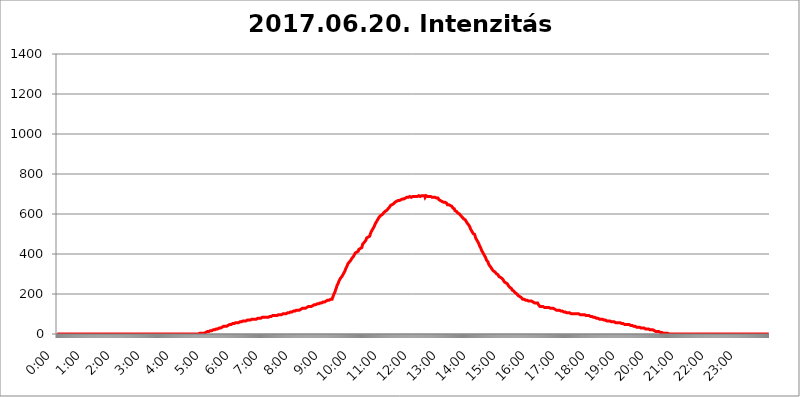
| Category | 2017.06.20. Intenzitás [W/m^2] |
|---|---|
| 0.0 | 0 |
| 0.0006944444444444445 | 0 |
| 0.001388888888888889 | 0 |
| 0.0020833333333333333 | 0 |
| 0.002777777777777778 | 0 |
| 0.003472222222222222 | 0 |
| 0.004166666666666667 | 0 |
| 0.004861111111111111 | 0 |
| 0.005555555555555556 | 0 |
| 0.0062499999999999995 | 0 |
| 0.006944444444444444 | 0 |
| 0.007638888888888889 | 0 |
| 0.008333333333333333 | 0 |
| 0.009027777777777779 | 0 |
| 0.009722222222222222 | 0 |
| 0.010416666666666666 | 0 |
| 0.011111111111111112 | 0 |
| 0.011805555555555555 | 0 |
| 0.012499999999999999 | 0 |
| 0.013194444444444444 | 0 |
| 0.013888888888888888 | 0 |
| 0.014583333333333332 | 0 |
| 0.015277777777777777 | 0 |
| 0.015972222222222224 | 0 |
| 0.016666666666666666 | 0 |
| 0.017361111111111112 | 0 |
| 0.018055555555555557 | 0 |
| 0.01875 | 0 |
| 0.019444444444444445 | 0 |
| 0.02013888888888889 | 0 |
| 0.020833333333333332 | 0 |
| 0.02152777777777778 | 0 |
| 0.022222222222222223 | 0 |
| 0.02291666666666667 | 0 |
| 0.02361111111111111 | 0 |
| 0.024305555555555556 | 0 |
| 0.024999999999999998 | 0 |
| 0.025694444444444447 | 0 |
| 0.02638888888888889 | 0 |
| 0.027083333333333334 | 0 |
| 0.027777777777777776 | 0 |
| 0.02847222222222222 | 0 |
| 0.029166666666666664 | 0 |
| 0.029861111111111113 | 0 |
| 0.030555555555555555 | 0 |
| 0.03125 | 0 |
| 0.03194444444444445 | 0 |
| 0.03263888888888889 | 0 |
| 0.03333333333333333 | 0 |
| 0.034027777777777775 | 0 |
| 0.034722222222222224 | 0 |
| 0.035416666666666666 | 0 |
| 0.036111111111111115 | 0 |
| 0.03680555555555556 | 0 |
| 0.0375 | 0 |
| 0.03819444444444444 | 0 |
| 0.03888888888888889 | 0 |
| 0.03958333333333333 | 0 |
| 0.04027777777777778 | 0 |
| 0.04097222222222222 | 0 |
| 0.041666666666666664 | 0 |
| 0.042361111111111106 | 0 |
| 0.04305555555555556 | 0 |
| 0.043750000000000004 | 0 |
| 0.044444444444444446 | 0 |
| 0.04513888888888889 | 0 |
| 0.04583333333333334 | 0 |
| 0.04652777777777778 | 0 |
| 0.04722222222222222 | 0 |
| 0.04791666666666666 | 0 |
| 0.04861111111111111 | 0 |
| 0.049305555555555554 | 0 |
| 0.049999999999999996 | 0 |
| 0.05069444444444445 | 0 |
| 0.051388888888888894 | 0 |
| 0.052083333333333336 | 0 |
| 0.05277777777777778 | 0 |
| 0.05347222222222222 | 0 |
| 0.05416666666666667 | 0 |
| 0.05486111111111111 | 0 |
| 0.05555555555555555 | 0 |
| 0.05625 | 0 |
| 0.05694444444444444 | 0 |
| 0.057638888888888885 | 0 |
| 0.05833333333333333 | 0 |
| 0.05902777777777778 | 0 |
| 0.059722222222222225 | 0 |
| 0.06041666666666667 | 0 |
| 0.061111111111111116 | 0 |
| 0.06180555555555556 | 0 |
| 0.0625 | 0 |
| 0.06319444444444444 | 0 |
| 0.06388888888888888 | 0 |
| 0.06458333333333334 | 0 |
| 0.06527777777777778 | 0 |
| 0.06597222222222222 | 0 |
| 0.06666666666666667 | 0 |
| 0.06736111111111111 | 0 |
| 0.06805555555555555 | 0 |
| 0.06874999999999999 | 0 |
| 0.06944444444444443 | 0 |
| 0.07013888888888889 | 0 |
| 0.07083333333333333 | 0 |
| 0.07152777777777779 | 0 |
| 0.07222222222222223 | 0 |
| 0.07291666666666667 | 0 |
| 0.07361111111111111 | 0 |
| 0.07430555555555556 | 0 |
| 0.075 | 0 |
| 0.07569444444444444 | 0 |
| 0.0763888888888889 | 0 |
| 0.07708333333333334 | 0 |
| 0.07777777777777778 | 0 |
| 0.07847222222222222 | 0 |
| 0.07916666666666666 | 0 |
| 0.0798611111111111 | 0 |
| 0.08055555555555556 | 0 |
| 0.08125 | 0 |
| 0.08194444444444444 | 0 |
| 0.08263888888888889 | 0 |
| 0.08333333333333333 | 0 |
| 0.08402777777777777 | 0 |
| 0.08472222222222221 | 0 |
| 0.08541666666666665 | 0 |
| 0.08611111111111112 | 0 |
| 0.08680555555555557 | 0 |
| 0.08750000000000001 | 0 |
| 0.08819444444444445 | 0 |
| 0.08888888888888889 | 0 |
| 0.08958333333333333 | 0 |
| 0.09027777777777778 | 0 |
| 0.09097222222222222 | 0 |
| 0.09166666666666667 | 0 |
| 0.09236111111111112 | 0 |
| 0.09305555555555556 | 0 |
| 0.09375 | 0 |
| 0.09444444444444444 | 0 |
| 0.09513888888888888 | 0 |
| 0.09583333333333333 | 0 |
| 0.09652777777777777 | 0 |
| 0.09722222222222222 | 0 |
| 0.09791666666666667 | 0 |
| 0.09861111111111111 | 0 |
| 0.09930555555555555 | 0 |
| 0.09999999999999999 | 0 |
| 0.10069444444444443 | 0 |
| 0.1013888888888889 | 0 |
| 0.10208333333333335 | 0 |
| 0.10277777777777779 | 0 |
| 0.10347222222222223 | 0 |
| 0.10416666666666667 | 0 |
| 0.10486111111111111 | 0 |
| 0.10555555555555556 | 0 |
| 0.10625 | 0 |
| 0.10694444444444444 | 0 |
| 0.1076388888888889 | 0 |
| 0.10833333333333334 | 0 |
| 0.10902777777777778 | 0 |
| 0.10972222222222222 | 0 |
| 0.1111111111111111 | 0 |
| 0.11180555555555556 | 0 |
| 0.11180555555555556 | 0 |
| 0.1125 | 0 |
| 0.11319444444444444 | 0 |
| 0.11388888888888889 | 0 |
| 0.11458333333333333 | 0 |
| 0.11527777777777777 | 0 |
| 0.11597222222222221 | 0 |
| 0.11666666666666665 | 0 |
| 0.1173611111111111 | 0 |
| 0.11805555555555557 | 0 |
| 0.11944444444444445 | 0 |
| 0.12013888888888889 | 0 |
| 0.12083333333333333 | 0 |
| 0.12152777777777778 | 0 |
| 0.12222222222222223 | 0 |
| 0.12291666666666667 | 0 |
| 0.12291666666666667 | 0 |
| 0.12361111111111112 | 0 |
| 0.12430555555555556 | 0 |
| 0.125 | 0 |
| 0.12569444444444444 | 0 |
| 0.12638888888888888 | 0 |
| 0.12708333333333333 | 0 |
| 0.16875 | 0 |
| 0.12847222222222224 | 0 |
| 0.12916666666666668 | 0 |
| 0.12986111111111112 | 0 |
| 0.13055555555555556 | 0 |
| 0.13125 | 0 |
| 0.13194444444444445 | 0 |
| 0.1326388888888889 | 0 |
| 0.13333333333333333 | 0 |
| 0.13402777777777777 | 0 |
| 0.13402777777777777 | 0 |
| 0.13472222222222222 | 0 |
| 0.13541666666666666 | 0 |
| 0.1361111111111111 | 0 |
| 0.13749999999999998 | 0 |
| 0.13819444444444443 | 0 |
| 0.1388888888888889 | 0 |
| 0.13958333333333334 | 0 |
| 0.14027777777777778 | 0 |
| 0.14097222222222222 | 0 |
| 0.14166666666666666 | 0 |
| 0.1423611111111111 | 0 |
| 0.14305555555555557 | 0 |
| 0.14375000000000002 | 0 |
| 0.14444444444444446 | 0 |
| 0.1451388888888889 | 0 |
| 0.1451388888888889 | 0 |
| 0.14652777777777778 | 0 |
| 0.14722222222222223 | 0 |
| 0.14791666666666667 | 0 |
| 0.1486111111111111 | 0 |
| 0.14930555555555555 | 0 |
| 0.15 | 0 |
| 0.15069444444444444 | 0 |
| 0.15138888888888888 | 0 |
| 0.15208333333333332 | 0 |
| 0.15277777777777776 | 0 |
| 0.15347222222222223 | 0 |
| 0.15416666666666667 | 0 |
| 0.15486111111111112 | 0 |
| 0.15555555555555556 | 0 |
| 0.15625 | 0 |
| 0.15694444444444444 | 0 |
| 0.15763888888888888 | 0 |
| 0.15833333333333333 | 0 |
| 0.15902777777777777 | 0 |
| 0.15972222222222224 | 0 |
| 0.16041666666666668 | 0 |
| 0.16111111111111112 | 0 |
| 0.16180555555555556 | 0 |
| 0.1625 | 0 |
| 0.16319444444444445 | 0 |
| 0.1638888888888889 | 0 |
| 0.16458333333333333 | 0 |
| 0.16527777777777777 | 0 |
| 0.16597222222222222 | 0 |
| 0.16666666666666666 | 0 |
| 0.1673611111111111 | 0 |
| 0.16805555555555554 | 0 |
| 0.16874999999999998 | 0 |
| 0.16944444444444443 | 0 |
| 0.17013888888888887 | 0 |
| 0.1708333333333333 | 0 |
| 0.17152777777777775 | 0 |
| 0.17222222222222225 | 0 |
| 0.1729166666666667 | 0 |
| 0.17361111111111113 | 0 |
| 0.17430555555555557 | 0 |
| 0.17500000000000002 | 0 |
| 0.17569444444444446 | 0 |
| 0.1763888888888889 | 0 |
| 0.17708333333333334 | 0 |
| 0.17777777777777778 | 0 |
| 0.17847222222222223 | 0 |
| 0.17916666666666667 | 0 |
| 0.1798611111111111 | 0 |
| 0.18055555555555555 | 0 |
| 0.18125 | 0 |
| 0.18194444444444444 | 0 |
| 0.1826388888888889 | 0 |
| 0.18333333333333335 | 0 |
| 0.1840277777777778 | 0 |
| 0.18472222222222223 | 0 |
| 0.18541666666666667 | 0 |
| 0.18611111111111112 | 0 |
| 0.18680555555555556 | 0 |
| 0.1875 | 0 |
| 0.18819444444444444 | 0 |
| 0.18888888888888888 | 0 |
| 0.18958333333333333 | 0 |
| 0.19027777777777777 | 0 |
| 0.1909722222222222 | 0 |
| 0.19166666666666665 | 0 |
| 0.19236111111111112 | 0 |
| 0.19305555555555554 | 0 |
| 0.19375 | 0 |
| 0.19444444444444445 | 0 |
| 0.1951388888888889 | 0 |
| 0.19583333333333333 | 0 |
| 0.19652777777777777 | 0 |
| 0.19722222222222222 | 0 |
| 0.19791666666666666 | 0 |
| 0.1986111111111111 | 0 |
| 0.19930555555555554 | 3.525 |
| 0.19999999999999998 | 3.525 |
| 0.20069444444444443 | 3.525 |
| 0.20138888888888887 | 3.525 |
| 0.2020833333333333 | 3.525 |
| 0.2027777777777778 | 3.525 |
| 0.2034722222222222 | 3.525 |
| 0.2041666666666667 | 3.525 |
| 0.20486111111111113 | 3.525 |
| 0.20555555555555557 | 3.525 |
| 0.20625000000000002 | 3.525 |
| 0.20694444444444446 | 3.525 |
| 0.2076388888888889 | 7.887 |
| 0.20833333333333334 | 7.887 |
| 0.20902777777777778 | 7.887 |
| 0.20972222222222223 | 7.887 |
| 0.21041666666666667 | 12.257 |
| 0.2111111111111111 | 12.257 |
| 0.21180555555555555 | 12.257 |
| 0.2125 | 12.257 |
| 0.21319444444444444 | 12.257 |
| 0.2138888888888889 | 12.257 |
| 0.21458333333333335 | 16.636 |
| 0.2152777777777778 | 16.636 |
| 0.21597222222222223 | 16.636 |
| 0.21666666666666667 | 16.636 |
| 0.21736111111111112 | 16.636 |
| 0.21805555555555556 | 16.636 |
| 0.21875 | 21.024 |
| 0.21944444444444444 | 21.024 |
| 0.22013888888888888 | 21.024 |
| 0.22083333333333333 | 21.024 |
| 0.22152777777777777 | 21.024 |
| 0.2222222222222222 | 21.024 |
| 0.22291666666666665 | 25.419 |
| 0.2236111111111111 | 25.419 |
| 0.22430555555555556 | 25.419 |
| 0.225 | 25.419 |
| 0.22569444444444445 | 25.419 |
| 0.2263888888888889 | 29.823 |
| 0.22708333333333333 | 29.823 |
| 0.22777777777777777 | 29.823 |
| 0.22847222222222222 | 29.823 |
| 0.22916666666666666 | 29.823 |
| 0.2298611111111111 | 29.823 |
| 0.23055555555555554 | 29.823 |
| 0.23124999999999998 | 34.234 |
| 0.23194444444444443 | 34.234 |
| 0.23263888888888887 | 34.234 |
| 0.2333333333333333 | 38.653 |
| 0.2340277777777778 | 38.653 |
| 0.2347222222222222 | 38.653 |
| 0.2354166666666667 | 38.653 |
| 0.23611111111111113 | 38.653 |
| 0.23680555555555557 | 38.653 |
| 0.23750000000000002 | 38.653 |
| 0.23819444444444446 | 38.653 |
| 0.2388888888888889 | 43.079 |
| 0.23958333333333334 | 43.079 |
| 0.24027777777777778 | 43.079 |
| 0.24097222222222223 | 47.511 |
| 0.24166666666666667 | 47.511 |
| 0.2423611111111111 | 47.511 |
| 0.24305555555555555 | 47.511 |
| 0.24375 | 47.511 |
| 0.24444444444444446 | 47.511 |
| 0.24513888888888888 | 47.511 |
| 0.24583333333333335 | 51.951 |
| 0.2465277777777778 | 51.951 |
| 0.24722222222222223 | 51.951 |
| 0.24791666666666667 | 51.951 |
| 0.24861111111111112 | 56.398 |
| 0.24930555555555556 | 56.398 |
| 0.25 | 56.398 |
| 0.25069444444444444 | 56.398 |
| 0.2513888888888889 | 56.398 |
| 0.2520833333333333 | 56.398 |
| 0.25277777777777777 | 56.398 |
| 0.2534722222222222 | 56.398 |
| 0.25416666666666665 | 56.398 |
| 0.2548611111111111 | 56.398 |
| 0.2555555555555556 | 60.85 |
| 0.25625000000000003 | 60.85 |
| 0.2569444444444445 | 60.85 |
| 0.2576388888888889 | 60.85 |
| 0.25833333333333336 | 60.85 |
| 0.2590277777777778 | 60.85 |
| 0.25972222222222224 | 60.85 |
| 0.2604166666666667 | 65.31 |
| 0.2611111111111111 | 65.31 |
| 0.26180555555555557 | 65.31 |
| 0.2625 | 65.31 |
| 0.26319444444444445 | 65.31 |
| 0.2638888888888889 | 65.31 |
| 0.26458333333333334 | 65.31 |
| 0.2652777777777778 | 65.31 |
| 0.2659722222222222 | 65.31 |
| 0.26666666666666666 | 69.775 |
| 0.2673611111111111 | 69.775 |
| 0.26805555555555555 | 69.775 |
| 0.26875 | 69.775 |
| 0.26944444444444443 | 69.775 |
| 0.2701388888888889 | 69.775 |
| 0.2708333333333333 | 69.775 |
| 0.27152777777777776 | 69.775 |
| 0.2722222222222222 | 74.246 |
| 0.27291666666666664 | 74.246 |
| 0.2736111111111111 | 74.246 |
| 0.2743055555555555 | 74.246 |
| 0.27499999999999997 | 74.246 |
| 0.27569444444444446 | 74.246 |
| 0.27638888888888885 | 74.246 |
| 0.27708333333333335 | 74.246 |
| 0.2777777777777778 | 74.246 |
| 0.27847222222222223 | 74.246 |
| 0.2791666666666667 | 74.246 |
| 0.2798611111111111 | 74.246 |
| 0.28055555555555556 | 78.722 |
| 0.28125 | 78.722 |
| 0.28194444444444444 | 78.722 |
| 0.2826388888888889 | 78.722 |
| 0.2833333333333333 | 78.722 |
| 0.28402777777777777 | 78.722 |
| 0.2847222222222222 | 78.722 |
| 0.28541666666666665 | 78.722 |
| 0.28611111111111115 | 78.722 |
| 0.28680555555555554 | 83.205 |
| 0.28750000000000003 | 83.205 |
| 0.2881944444444445 | 83.205 |
| 0.2888888888888889 | 83.205 |
| 0.28958333333333336 | 83.205 |
| 0.2902777777777778 | 83.205 |
| 0.29097222222222224 | 83.205 |
| 0.2916666666666667 | 83.205 |
| 0.2923611111111111 | 83.205 |
| 0.29305555555555557 | 83.205 |
| 0.29375 | 83.205 |
| 0.29444444444444445 | 83.205 |
| 0.2951388888888889 | 87.692 |
| 0.29583333333333334 | 83.205 |
| 0.2965277777777778 | 87.692 |
| 0.2972222222222222 | 87.692 |
| 0.29791666666666666 | 87.692 |
| 0.2986111111111111 | 87.692 |
| 0.29930555555555555 | 87.692 |
| 0.3 | 87.692 |
| 0.30069444444444443 | 87.692 |
| 0.3013888888888889 | 87.692 |
| 0.3020833333333333 | 92.184 |
| 0.30277777777777776 | 92.184 |
| 0.3034722222222222 | 92.184 |
| 0.30416666666666664 | 92.184 |
| 0.3048611111111111 | 92.184 |
| 0.3055555555555555 | 92.184 |
| 0.30624999999999997 | 92.184 |
| 0.3069444444444444 | 92.184 |
| 0.3076388888888889 | 92.184 |
| 0.30833333333333335 | 92.184 |
| 0.3090277777777778 | 96.682 |
| 0.30972222222222223 | 96.682 |
| 0.3104166666666667 | 96.682 |
| 0.3111111111111111 | 96.682 |
| 0.31180555555555556 | 96.682 |
| 0.3125 | 96.682 |
| 0.31319444444444444 | 96.682 |
| 0.3138888888888889 | 96.682 |
| 0.3145833333333333 | 96.682 |
| 0.31527777777777777 | 96.682 |
| 0.3159722222222222 | 101.184 |
| 0.31666666666666665 | 101.184 |
| 0.31736111111111115 | 101.184 |
| 0.31805555555555554 | 101.184 |
| 0.31875000000000003 | 101.184 |
| 0.3194444444444445 | 101.184 |
| 0.3201388888888889 | 101.184 |
| 0.32083333333333336 | 101.184 |
| 0.3215277777777778 | 101.184 |
| 0.32222222222222224 | 101.184 |
| 0.3229166666666667 | 105.69 |
| 0.3236111111111111 | 105.69 |
| 0.32430555555555557 | 105.69 |
| 0.325 | 105.69 |
| 0.32569444444444445 | 105.69 |
| 0.3263888888888889 | 110.201 |
| 0.32708333333333334 | 110.201 |
| 0.3277777777777778 | 110.201 |
| 0.3284722222222222 | 110.201 |
| 0.32916666666666666 | 110.201 |
| 0.3298611111111111 | 110.201 |
| 0.33055555555555555 | 114.716 |
| 0.33125 | 114.716 |
| 0.33194444444444443 | 114.716 |
| 0.3326388888888889 | 114.716 |
| 0.3333333333333333 | 114.716 |
| 0.3340277777777778 | 114.716 |
| 0.3347222222222222 | 119.235 |
| 0.3354166666666667 | 119.235 |
| 0.3361111111111111 | 119.235 |
| 0.3368055555555556 | 119.235 |
| 0.33749999999999997 | 119.235 |
| 0.33819444444444446 | 119.235 |
| 0.33888888888888885 | 119.235 |
| 0.33958333333333335 | 119.235 |
| 0.34027777777777773 | 123.758 |
| 0.34097222222222223 | 123.758 |
| 0.3416666666666666 | 123.758 |
| 0.3423611111111111 | 123.758 |
| 0.3430555555555555 | 123.758 |
| 0.34375 | 128.284 |
| 0.3444444444444445 | 128.284 |
| 0.3451388888888889 | 128.284 |
| 0.3458333333333334 | 128.284 |
| 0.34652777777777777 | 128.284 |
| 0.34722222222222227 | 128.284 |
| 0.34791666666666665 | 128.284 |
| 0.34861111111111115 | 128.284 |
| 0.34930555555555554 | 132.814 |
| 0.35000000000000003 | 132.814 |
| 0.3506944444444444 | 132.814 |
| 0.3513888888888889 | 137.347 |
| 0.3520833333333333 | 137.347 |
| 0.3527777777777778 | 137.347 |
| 0.3534722222222222 | 137.347 |
| 0.3541666666666667 | 137.347 |
| 0.3548611111111111 | 137.347 |
| 0.35555555555555557 | 137.347 |
| 0.35625 | 137.347 |
| 0.35694444444444445 | 141.884 |
| 0.3576388888888889 | 141.884 |
| 0.35833333333333334 | 141.884 |
| 0.3590277777777778 | 141.884 |
| 0.3597222222222222 | 146.423 |
| 0.36041666666666666 | 146.423 |
| 0.3611111111111111 | 146.423 |
| 0.36180555555555555 | 146.423 |
| 0.3625 | 146.423 |
| 0.36319444444444443 | 146.423 |
| 0.3638888888888889 | 146.423 |
| 0.3645833333333333 | 150.964 |
| 0.3652777777777778 | 150.964 |
| 0.3659722222222222 | 150.964 |
| 0.3666666666666667 | 150.964 |
| 0.3673611111111111 | 150.964 |
| 0.3680555555555556 | 150.964 |
| 0.36874999999999997 | 155.509 |
| 0.36944444444444446 | 155.509 |
| 0.37013888888888885 | 155.509 |
| 0.37083333333333335 | 155.509 |
| 0.37152777777777773 | 155.509 |
| 0.37222222222222223 | 155.509 |
| 0.3729166666666666 | 160.056 |
| 0.3736111111111111 | 160.056 |
| 0.3743055555555555 | 160.056 |
| 0.375 | 160.056 |
| 0.3756944444444445 | 164.605 |
| 0.3763888888888889 | 164.605 |
| 0.3770833333333334 | 164.605 |
| 0.37777777777777777 | 164.605 |
| 0.37847222222222227 | 169.156 |
| 0.37916666666666665 | 169.156 |
| 0.37986111111111115 | 169.156 |
| 0.38055555555555554 | 169.156 |
| 0.38125000000000003 | 169.156 |
| 0.3819444444444444 | 169.156 |
| 0.3826388888888889 | 173.709 |
| 0.3833333333333333 | 173.709 |
| 0.3840277777777778 | 173.709 |
| 0.3847222222222222 | 173.709 |
| 0.3854166666666667 | 173.709 |
| 0.3861111111111111 | 178.264 |
| 0.38680555555555557 | 187.378 |
| 0.3875 | 191.937 |
| 0.38819444444444445 | 201.058 |
| 0.3888888888888889 | 201.058 |
| 0.38958333333333334 | 210.182 |
| 0.3902777777777778 | 219.309 |
| 0.3909722222222222 | 223.873 |
| 0.39166666666666666 | 233 |
| 0.3923611111111111 | 242.127 |
| 0.39305555555555555 | 246.689 |
| 0.39375 | 251.251 |
| 0.39444444444444443 | 255.813 |
| 0.3951388888888889 | 264.932 |
| 0.3958333333333333 | 264.932 |
| 0.3965277777777778 | 269.49 |
| 0.3972222222222222 | 278.603 |
| 0.3979166666666667 | 278.603 |
| 0.3986111111111111 | 283.156 |
| 0.3993055555555556 | 287.709 |
| 0.39999999999999997 | 292.259 |
| 0.40069444444444446 | 296.808 |
| 0.40138888888888885 | 301.354 |
| 0.40208333333333335 | 305.898 |
| 0.40277777777777773 | 310.44 |
| 0.40347222222222223 | 314.98 |
| 0.4041666666666666 | 319.517 |
| 0.4048611111111111 | 328.584 |
| 0.4055555555555555 | 333.113 |
| 0.40625 | 337.639 |
| 0.4069444444444445 | 342.162 |
| 0.4076388888888889 | 351.198 |
| 0.4083333333333334 | 355.712 |
| 0.40902777777777777 | 355.712 |
| 0.40972222222222227 | 360.221 |
| 0.41041666666666665 | 364.728 |
| 0.41111111111111115 | 364.728 |
| 0.41180555555555554 | 369.23 |
| 0.41250000000000003 | 373.729 |
| 0.4131944444444444 | 378.224 |
| 0.4138888888888889 | 378.224 |
| 0.4145833333333333 | 382.715 |
| 0.4152777777777778 | 387.202 |
| 0.4159722222222222 | 391.685 |
| 0.4166666666666667 | 396.164 |
| 0.4173611111111111 | 400.638 |
| 0.41805555555555557 | 405.108 |
| 0.41875 | 405.108 |
| 0.41944444444444445 | 405.108 |
| 0.4201388888888889 | 409.574 |
| 0.42083333333333334 | 409.574 |
| 0.4215277777777778 | 409.574 |
| 0.4222222222222222 | 414.035 |
| 0.42291666666666666 | 422.943 |
| 0.4236111111111111 | 418.492 |
| 0.42430555555555555 | 422.943 |
| 0.425 | 427.39 |
| 0.42569444444444443 | 431.833 |
| 0.4263888888888889 | 431.833 |
| 0.4270833333333333 | 431.833 |
| 0.4277777777777778 | 440.702 |
| 0.4284722222222222 | 449.551 |
| 0.4291666666666667 | 449.551 |
| 0.4298611111111111 | 453.968 |
| 0.4305555555555556 | 458.38 |
| 0.43124999999999997 | 458.38 |
| 0.43194444444444446 | 462.786 |
| 0.43263888888888885 | 467.187 |
| 0.43333333333333335 | 467.187 |
| 0.43402777777777773 | 480.356 |
| 0.43472222222222223 | 480.356 |
| 0.4354166666666666 | 484.735 |
| 0.4361111111111111 | 484.735 |
| 0.4368055555555555 | 484.735 |
| 0.4375 | 489.108 |
| 0.4381944444444445 | 489.108 |
| 0.4388888888888889 | 497.836 |
| 0.4395833333333334 | 502.192 |
| 0.44027777777777777 | 510.885 |
| 0.44097222222222227 | 515.223 |
| 0.44166666666666665 | 519.555 |
| 0.44236111111111115 | 523.88 |
| 0.44305555555555554 | 528.2 |
| 0.44375000000000003 | 528.2 |
| 0.4444444444444444 | 536.82 |
| 0.4451388888888889 | 541.121 |
| 0.4458333333333333 | 549.704 |
| 0.4465277777777778 | 553.986 |
| 0.4472222222222222 | 558.261 |
| 0.4479166666666667 | 562.53 |
| 0.4486111111111111 | 566.793 |
| 0.44930555555555557 | 571.049 |
| 0.45 | 575.299 |
| 0.45069444444444445 | 579.542 |
| 0.4513888888888889 | 583.779 |
| 0.45208333333333334 | 583.779 |
| 0.4527777777777778 | 588.009 |
| 0.4534722222222222 | 592.233 |
| 0.45416666666666666 | 592.233 |
| 0.4548611111111111 | 596.45 |
| 0.45555555555555555 | 596.45 |
| 0.45625 | 600.661 |
| 0.45694444444444443 | 600.661 |
| 0.4576388888888889 | 604.864 |
| 0.4583333333333333 | 609.062 |
| 0.4590277777777778 | 609.062 |
| 0.4597222222222222 | 613.252 |
| 0.4604166666666667 | 613.252 |
| 0.4611111111111111 | 617.436 |
| 0.4618055555555556 | 617.436 |
| 0.46249999999999997 | 617.436 |
| 0.46319444444444446 | 621.613 |
| 0.46388888888888885 | 625.784 |
| 0.46458333333333335 | 629.948 |
| 0.46527777777777773 | 629.948 |
| 0.46597222222222223 | 634.105 |
| 0.4666666666666666 | 638.256 |
| 0.4673611111111111 | 642.4 |
| 0.4680555555555555 | 642.4 |
| 0.46875 | 642.4 |
| 0.4694444444444445 | 646.537 |
| 0.4701388888888889 | 650.667 |
| 0.4708333333333334 | 650.667 |
| 0.47152777777777777 | 650.667 |
| 0.47222222222222227 | 650.667 |
| 0.47291666666666665 | 654.791 |
| 0.47361111111111115 | 658.909 |
| 0.47430555555555554 | 654.791 |
| 0.47500000000000003 | 658.909 |
| 0.4756944444444444 | 663.019 |
| 0.4763888888888889 | 658.909 |
| 0.4770833333333333 | 663.019 |
| 0.4777777777777778 | 667.123 |
| 0.4784722222222222 | 667.123 |
| 0.4791666666666667 | 667.123 |
| 0.4798611111111111 | 667.123 |
| 0.48055555555555557 | 667.123 |
| 0.48125 | 667.123 |
| 0.48194444444444445 | 671.22 |
| 0.4826388888888889 | 671.22 |
| 0.48333333333333334 | 671.22 |
| 0.4840277777777778 | 675.311 |
| 0.4847222222222222 | 675.311 |
| 0.48541666666666666 | 675.311 |
| 0.4861111111111111 | 675.311 |
| 0.48680555555555555 | 675.311 |
| 0.4875 | 679.395 |
| 0.48819444444444443 | 679.395 |
| 0.4888888888888889 | 675.311 |
| 0.4895833333333333 | 679.395 |
| 0.4902777777777778 | 683.473 |
| 0.4909722222222222 | 679.395 |
| 0.4916666666666667 | 683.473 |
| 0.4923611111111111 | 683.473 |
| 0.4930555555555556 | 679.395 |
| 0.49374999999999997 | 683.473 |
| 0.49444444444444446 | 687.544 |
| 0.49513888888888885 | 683.473 |
| 0.49583333333333335 | 683.473 |
| 0.49652777777777773 | 683.473 |
| 0.49722222222222223 | 683.473 |
| 0.4979166666666666 | 683.473 |
| 0.4986111111111111 | 687.544 |
| 0.4993055555555555 | 687.544 |
| 0.5 | 687.544 |
| 0.5006944444444444 | 687.544 |
| 0.5013888888888889 | 687.544 |
| 0.5020833333333333 | 687.544 |
| 0.5027777777777778 | 687.544 |
| 0.5034722222222222 | 687.544 |
| 0.5041666666666667 | 691.608 |
| 0.5048611111111111 | 687.544 |
| 0.5055555555555555 | 687.544 |
| 0.50625 | 691.608 |
| 0.5069444444444444 | 691.608 |
| 0.5076388888888889 | 691.608 |
| 0.5083333333333333 | 691.608 |
| 0.5090277777777777 | 687.544 |
| 0.5097222222222222 | 687.544 |
| 0.5104166666666666 | 687.544 |
| 0.5111111111111112 | 691.608 |
| 0.5118055555555555 | 691.608 |
| 0.5125000000000001 | 691.608 |
| 0.5131944444444444 | 691.608 |
| 0.513888888888889 | 691.608 |
| 0.5145833333333333 | 691.608 |
| 0.5152777777777778 | 691.608 |
| 0.5159722222222222 | 683.473 |
| 0.5166666666666667 | 687.544 |
| 0.517361111111111 | 691.608 |
| 0.5180555555555556 | 687.544 |
| 0.5187499999999999 | 687.544 |
| 0.5194444444444445 | 687.544 |
| 0.5201388888888888 | 687.544 |
| 0.5208333333333334 | 683.473 |
| 0.5215277777777778 | 687.544 |
| 0.5222222222222223 | 687.544 |
| 0.5229166666666667 | 687.544 |
| 0.5236111111111111 | 687.544 |
| 0.5243055555555556 | 683.473 |
| 0.525 | 683.473 |
| 0.5256944444444445 | 683.473 |
| 0.5263888888888889 | 683.473 |
| 0.5270833333333333 | 683.473 |
| 0.5277777777777778 | 683.473 |
| 0.5284722222222222 | 683.473 |
| 0.5291666666666667 | 683.473 |
| 0.5298611111111111 | 683.473 |
| 0.5305555555555556 | 679.395 |
| 0.53125 | 679.395 |
| 0.5319444444444444 | 679.395 |
| 0.5326388888888889 | 679.395 |
| 0.5333333333333333 | 679.395 |
| 0.5340277777777778 | 679.395 |
| 0.5347222222222222 | 675.311 |
| 0.5354166666666667 | 671.22 |
| 0.5361111111111111 | 671.22 |
| 0.5368055555555555 | 667.123 |
| 0.5375 | 667.123 |
| 0.5381944444444444 | 667.123 |
| 0.5388888888888889 | 667.123 |
| 0.5395833333333333 | 663.019 |
| 0.5402777777777777 | 663.019 |
| 0.5409722222222222 | 663.019 |
| 0.5416666666666666 | 658.909 |
| 0.5423611111111112 | 658.909 |
| 0.5430555555555555 | 658.909 |
| 0.5437500000000001 | 658.909 |
| 0.5444444444444444 | 658.909 |
| 0.545138888888889 | 654.791 |
| 0.5458333333333333 | 654.791 |
| 0.5465277777777778 | 650.667 |
| 0.5472222222222222 | 646.537 |
| 0.5479166666666667 | 646.537 |
| 0.548611111111111 | 646.537 |
| 0.5493055555555556 | 646.537 |
| 0.5499999999999999 | 646.537 |
| 0.5506944444444445 | 642.4 |
| 0.5513888888888888 | 642.4 |
| 0.5520833333333334 | 638.256 |
| 0.5527777777777778 | 638.256 |
| 0.5534722222222223 | 638.256 |
| 0.5541666666666667 | 634.105 |
| 0.5548611111111111 | 629.948 |
| 0.5555555555555556 | 629.948 |
| 0.55625 | 629.948 |
| 0.5569444444444445 | 625.784 |
| 0.5576388888888889 | 617.436 |
| 0.5583333333333333 | 621.613 |
| 0.5590277777777778 | 613.252 |
| 0.5597222222222222 | 613.252 |
| 0.5604166666666667 | 613.252 |
| 0.5611111111111111 | 613.252 |
| 0.5618055555555556 | 604.864 |
| 0.5625 | 600.661 |
| 0.5631944444444444 | 600.661 |
| 0.5638888888888889 | 600.661 |
| 0.5645833333333333 | 596.45 |
| 0.5652777777777778 | 596.45 |
| 0.5659722222222222 | 592.233 |
| 0.5666666666666667 | 588.009 |
| 0.5673611111111111 | 588.009 |
| 0.5680555555555555 | 583.779 |
| 0.56875 | 583.779 |
| 0.5694444444444444 | 579.542 |
| 0.5701388888888889 | 575.299 |
| 0.5708333333333333 | 571.049 |
| 0.5715277777777777 | 571.049 |
| 0.5722222222222222 | 571.049 |
| 0.5729166666666666 | 566.793 |
| 0.5736111111111112 | 562.53 |
| 0.5743055555555555 | 558.261 |
| 0.5750000000000001 | 553.986 |
| 0.5756944444444444 | 549.704 |
| 0.576388888888889 | 549.704 |
| 0.5770833333333333 | 545.416 |
| 0.5777777777777778 | 541.121 |
| 0.5784722222222222 | 536.82 |
| 0.5791666666666667 | 532.513 |
| 0.579861111111111 | 523.88 |
| 0.5805555555555556 | 519.555 |
| 0.5812499999999999 | 519.555 |
| 0.5819444444444445 | 510.885 |
| 0.5826388888888888 | 506.542 |
| 0.5833333333333334 | 502.192 |
| 0.5840277777777778 | 502.192 |
| 0.5847222222222223 | 497.836 |
| 0.5854166666666667 | 497.836 |
| 0.5861111111111111 | 489.108 |
| 0.5868055555555556 | 480.356 |
| 0.5875 | 475.972 |
| 0.5881944444444445 | 471.582 |
| 0.5888888888888889 | 467.187 |
| 0.5895833333333333 | 462.786 |
| 0.5902777777777778 | 458.38 |
| 0.5909722222222222 | 453.968 |
| 0.5916666666666667 | 449.551 |
| 0.5923611111111111 | 440.702 |
| 0.5930555555555556 | 436.27 |
| 0.59375 | 431.833 |
| 0.5944444444444444 | 427.39 |
| 0.5951388888888889 | 418.492 |
| 0.5958333333333333 | 414.035 |
| 0.5965277777777778 | 409.574 |
| 0.5972222222222222 | 405.108 |
| 0.5979166666666667 | 400.638 |
| 0.5986111111111111 | 396.164 |
| 0.5993055555555555 | 391.685 |
| 0.6 | 387.202 |
| 0.6006944444444444 | 382.715 |
| 0.6013888888888889 | 378.224 |
| 0.6020833333333333 | 369.23 |
| 0.6027777777777777 | 369.23 |
| 0.6034722222222222 | 364.728 |
| 0.6041666666666666 | 360.221 |
| 0.6048611111111112 | 351.198 |
| 0.6055555555555555 | 351.198 |
| 0.6062500000000001 | 342.162 |
| 0.6069444444444444 | 337.639 |
| 0.607638888888889 | 337.639 |
| 0.6083333333333333 | 333.113 |
| 0.6090277777777778 | 328.584 |
| 0.6097222222222222 | 324.052 |
| 0.6104166666666667 | 324.052 |
| 0.611111111111111 | 319.517 |
| 0.6118055555555556 | 314.98 |
| 0.6124999999999999 | 314.98 |
| 0.6131944444444445 | 314.98 |
| 0.6138888888888888 | 310.44 |
| 0.6145833333333334 | 305.898 |
| 0.6152777777777778 | 305.898 |
| 0.6159722222222223 | 301.354 |
| 0.6166666666666667 | 301.354 |
| 0.6173611111111111 | 296.808 |
| 0.6180555555555556 | 296.808 |
| 0.61875 | 292.259 |
| 0.6194444444444445 | 287.709 |
| 0.6201388888888889 | 287.709 |
| 0.6208333333333333 | 287.709 |
| 0.6215277777777778 | 283.156 |
| 0.6222222222222222 | 283.156 |
| 0.6229166666666667 | 278.603 |
| 0.6236111111111111 | 278.603 |
| 0.6243055555555556 | 274.047 |
| 0.625 | 274.047 |
| 0.6256944444444444 | 269.49 |
| 0.6263888888888889 | 264.932 |
| 0.6270833333333333 | 260.373 |
| 0.6277777777777778 | 260.373 |
| 0.6284722222222222 | 255.813 |
| 0.6291666666666667 | 255.813 |
| 0.6298611111111111 | 251.251 |
| 0.6305555555555555 | 251.251 |
| 0.63125 | 251.251 |
| 0.6319444444444444 | 246.689 |
| 0.6326388888888889 | 242.127 |
| 0.6333333333333333 | 242.127 |
| 0.6340277777777777 | 237.564 |
| 0.6347222222222222 | 233 |
| 0.6354166666666666 | 233 |
| 0.6361111111111112 | 228.436 |
| 0.6368055555555555 | 228.436 |
| 0.6375000000000001 | 223.873 |
| 0.6381944444444444 | 219.309 |
| 0.638888888888889 | 219.309 |
| 0.6395833333333333 | 214.746 |
| 0.6402777777777778 | 214.746 |
| 0.6409722222222222 | 210.182 |
| 0.6416666666666667 | 210.182 |
| 0.642361111111111 | 205.62 |
| 0.6430555555555556 | 201.058 |
| 0.6437499999999999 | 201.058 |
| 0.6444444444444445 | 201.058 |
| 0.6451388888888888 | 196.497 |
| 0.6458333333333334 | 196.497 |
| 0.6465277777777778 | 191.937 |
| 0.6472222222222223 | 191.937 |
| 0.6479166666666667 | 191.937 |
| 0.6486111111111111 | 187.378 |
| 0.6493055555555556 | 187.378 |
| 0.65 | 182.82 |
| 0.6506944444444445 | 182.82 |
| 0.6513888888888889 | 178.264 |
| 0.6520833333333333 | 178.264 |
| 0.6527777777777778 | 173.709 |
| 0.6534722222222222 | 173.709 |
| 0.6541666666666667 | 173.709 |
| 0.6548611111111111 | 173.709 |
| 0.6555555555555556 | 169.156 |
| 0.65625 | 169.156 |
| 0.6569444444444444 | 169.156 |
| 0.6576388888888889 | 169.156 |
| 0.6583333333333333 | 169.156 |
| 0.6590277777777778 | 169.156 |
| 0.6597222222222222 | 169.156 |
| 0.6604166666666667 | 164.605 |
| 0.6611111111111111 | 164.605 |
| 0.6618055555555555 | 164.605 |
| 0.6625 | 164.605 |
| 0.6631944444444444 | 164.605 |
| 0.6638888888888889 | 164.605 |
| 0.6645833333333333 | 164.605 |
| 0.6652777777777777 | 164.605 |
| 0.6659722222222222 | 160.056 |
| 0.6666666666666666 | 160.056 |
| 0.6673611111111111 | 160.056 |
| 0.6680555555555556 | 155.509 |
| 0.6687500000000001 | 155.509 |
| 0.6694444444444444 | 155.509 |
| 0.6701388888888888 | 155.509 |
| 0.6708333333333334 | 155.509 |
| 0.6715277777777778 | 155.509 |
| 0.6722222222222222 | 155.509 |
| 0.6729166666666666 | 155.509 |
| 0.6736111111111112 | 155.509 |
| 0.6743055555555556 | 150.964 |
| 0.6749999999999999 | 146.423 |
| 0.6756944444444444 | 141.884 |
| 0.6763888888888889 | 141.884 |
| 0.6770833333333334 | 137.347 |
| 0.6777777777777777 | 137.347 |
| 0.6784722222222223 | 137.347 |
| 0.6791666666666667 | 137.347 |
| 0.6798611111111111 | 137.347 |
| 0.6805555555555555 | 137.347 |
| 0.68125 | 137.347 |
| 0.6819444444444445 | 137.347 |
| 0.6826388888888889 | 137.347 |
| 0.6833333333333332 | 132.814 |
| 0.6840277777777778 | 132.814 |
| 0.6847222222222222 | 132.814 |
| 0.6854166666666667 | 132.814 |
| 0.686111111111111 | 132.814 |
| 0.6868055555555556 | 132.814 |
| 0.6875 | 132.814 |
| 0.6881944444444444 | 132.814 |
| 0.688888888888889 | 132.814 |
| 0.6895833333333333 | 132.814 |
| 0.6902777777777778 | 128.284 |
| 0.6909722222222222 | 128.284 |
| 0.6916666666666668 | 128.284 |
| 0.6923611111111111 | 128.284 |
| 0.6930555555555555 | 128.284 |
| 0.69375 | 128.284 |
| 0.6944444444444445 | 128.284 |
| 0.6951388888888889 | 128.284 |
| 0.6958333333333333 | 128.284 |
| 0.6965277777777777 | 123.758 |
| 0.6972222222222223 | 123.758 |
| 0.6979166666666666 | 123.758 |
| 0.6986111111111111 | 123.758 |
| 0.6993055555555556 | 123.758 |
| 0.7000000000000001 | 119.235 |
| 0.7006944444444444 | 119.235 |
| 0.7013888888888888 | 119.235 |
| 0.7020833333333334 | 119.235 |
| 0.7027777777777778 | 119.235 |
| 0.7034722222222222 | 119.235 |
| 0.7041666666666666 | 119.235 |
| 0.7048611111111112 | 119.235 |
| 0.7055555555555556 | 114.716 |
| 0.7062499999999999 | 114.716 |
| 0.7069444444444444 | 114.716 |
| 0.7076388888888889 | 114.716 |
| 0.7083333333333334 | 114.716 |
| 0.7090277777777777 | 110.201 |
| 0.7097222222222223 | 110.201 |
| 0.7104166666666667 | 110.201 |
| 0.7111111111111111 | 110.201 |
| 0.7118055555555555 | 110.201 |
| 0.7125 | 110.201 |
| 0.7131944444444445 | 105.69 |
| 0.7138888888888889 | 110.201 |
| 0.7145833333333332 | 105.69 |
| 0.7152777777777778 | 105.69 |
| 0.7159722222222222 | 105.69 |
| 0.7166666666666667 | 105.69 |
| 0.717361111111111 | 105.69 |
| 0.7180555555555556 | 105.69 |
| 0.71875 | 105.69 |
| 0.7194444444444444 | 105.69 |
| 0.720138888888889 | 105.69 |
| 0.7208333333333333 | 101.184 |
| 0.7215277777777778 | 101.184 |
| 0.7222222222222222 | 101.184 |
| 0.7229166666666668 | 101.184 |
| 0.7236111111111111 | 101.184 |
| 0.7243055555555555 | 101.184 |
| 0.725 | 101.184 |
| 0.7256944444444445 | 101.184 |
| 0.7263888888888889 | 101.184 |
| 0.7270833333333333 | 101.184 |
| 0.7277777777777777 | 101.184 |
| 0.7284722222222223 | 101.184 |
| 0.7291666666666666 | 101.184 |
| 0.7298611111111111 | 101.184 |
| 0.7305555555555556 | 101.184 |
| 0.7312500000000001 | 101.184 |
| 0.7319444444444444 | 96.682 |
| 0.7326388888888888 | 96.682 |
| 0.7333333333333334 | 96.682 |
| 0.7340277777777778 | 96.682 |
| 0.7347222222222222 | 96.682 |
| 0.7354166666666666 | 96.682 |
| 0.7361111111111112 | 96.682 |
| 0.7368055555555556 | 96.682 |
| 0.7374999999999999 | 96.682 |
| 0.7381944444444444 | 96.682 |
| 0.7388888888888889 | 96.682 |
| 0.7395833333333334 | 96.682 |
| 0.7402777777777777 | 96.682 |
| 0.7409722222222223 | 92.184 |
| 0.7416666666666667 | 92.184 |
| 0.7423611111111111 | 92.184 |
| 0.7430555555555555 | 92.184 |
| 0.74375 | 92.184 |
| 0.7444444444444445 | 92.184 |
| 0.7451388888888889 | 92.184 |
| 0.7458333333333332 | 92.184 |
| 0.7465277777777778 | 92.184 |
| 0.7472222222222222 | 92.184 |
| 0.7479166666666667 | 87.692 |
| 0.748611111111111 | 87.692 |
| 0.7493055555555556 | 87.692 |
| 0.75 | 87.692 |
| 0.7506944444444444 | 87.692 |
| 0.751388888888889 | 83.205 |
| 0.7520833333333333 | 83.205 |
| 0.7527777777777778 | 83.205 |
| 0.7534722222222222 | 83.205 |
| 0.7541666666666668 | 83.205 |
| 0.7548611111111111 | 83.205 |
| 0.7555555555555555 | 78.722 |
| 0.75625 | 78.722 |
| 0.7569444444444445 | 78.722 |
| 0.7576388888888889 | 78.722 |
| 0.7583333333333333 | 78.722 |
| 0.7590277777777777 | 78.722 |
| 0.7597222222222223 | 74.246 |
| 0.7604166666666666 | 74.246 |
| 0.7611111111111111 | 74.246 |
| 0.7618055555555556 | 74.246 |
| 0.7625000000000001 | 74.246 |
| 0.7631944444444444 | 74.246 |
| 0.7638888888888888 | 74.246 |
| 0.7645833333333334 | 74.246 |
| 0.7652777777777778 | 69.775 |
| 0.7659722222222222 | 69.775 |
| 0.7666666666666666 | 69.775 |
| 0.7673611111111112 | 69.775 |
| 0.7680555555555556 | 69.775 |
| 0.7687499999999999 | 69.775 |
| 0.7694444444444444 | 65.31 |
| 0.7701388888888889 | 65.31 |
| 0.7708333333333334 | 65.31 |
| 0.7715277777777777 | 65.31 |
| 0.7722222222222223 | 65.31 |
| 0.7729166666666667 | 65.31 |
| 0.7736111111111111 | 65.31 |
| 0.7743055555555555 | 65.31 |
| 0.775 | 65.31 |
| 0.7756944444444445 | 65.31 |
| 0.7763888888888889 | 60.85 |
| 0.7770833333333332 | 60.85 |
| 0.7777777777777778 | 60.85 |
| 0.7784722222222222 | 60.85 |
| 0.7791666666666667 | 60.85 |
| 0.779861111111111 | 60.85 |
| 0.7805555555555556 | 60.85 |
| 0.78125 | 60.85 |
| 0.7819444444444444 | 56.398 |
| 0.782638888888889 | 56.398 |
| 0.7833333333333333 | 56.398 |
| 0.7840277777777778 | 56.398 |
| 0.7847222222222222 | 56.398 |
| 0.7854166666666668 | 56.398 |
| 0.7861111111111111 | 56.398 |
| 0.7868055555555555 | 56.398 |
| 0.7875 | 56.398 |
| 0.7881944444444445 | 56.398 |
| 0.7888888888888889 | 56.398 |
| 0.7895833333333333 | 56.398 |
| 0.7902777777777777 | 51.951 |
| 0.7909722222222223 | 51.951 |
| 0.7916666666666666 | 51.951 |
| 0.7923611111111111 | 51.951 |
| 0.7930555555555556 | 51.951 |
| 0.7937500000000001 | 51.951 |
| 0.7944444444444444 | 51.951 |
| 0.7951388888888888 | 51.951 |
| 0.7958333333333334 | 47.511 |
| 0.7965277777777778 | 47.511 |
| 0.7972222222222222 | 47.511 |
| 0.7979166666666666 | 47.511 |
| 0.7986111111111112 | 47.511 |
| 0.7993055555555556 | 47.511 |
| 0.7999999999999999 | 47.511 |
| 0.8006944444444444 | 47.511 |
| 0.8013888888888889 | 47.511 |
| 0.8020833333333334 | 47.511 |
| 0.8027777777777777 | 43.079 |
| 0.8034722222222223 | 43.079 |
| 0.8041666666666667 | 43.079 |
| 0.8048611111111111 | 43.079 |
| 0.8055555555555555 | 43.079 |
| 0.80625 | 43.079 |
| 0.8069444444444445 | 38.653 |
| 0.8076388888888889 | 38.653 |
| 0.8083333333333332 | 38.653 |
| 0.8090277777777778 | 38.653 |
| 0.8097222222222222 | 38.653 |
| 0.8104166666666667 | 38.653 |
| 0.811111111111111 | 38.653 |
| 0.8118055555555556 | 38.653 |
| 0.8125 | 34.234 |
| 0.8131944444444444 | 34.234 |
| 0.813888888888889 | 34.234 |
| 0.8145833333333333 | 34.234 |
| 0.8152777777777778 | 34.234 |
| 0.8159722222222222 | 34.234 |
| 0.8166666666666668 | 34.234 |
| 0.8173611111111111 | 34.234 |
| 0.8180555555555555 | 34.234 |
| 0.81875 | 29.823 |
| 0.8194444444444445 | 29.823 |
| 0.8201388888888889 | 29.823 |
| 0.8208333333333333 | 29.823 |
| 0.8215277777777777 | 29.823 |
| 0.8222222222222223 | 29.823 |
| 0.8229166666666666 | 29.823 |
| 0.8236111111111111 | 29.823 |
| 0.8243055555555556 | 25.419 |
| 0.8250000000000001 | 25.419 |
| 0.8256944444444444 | 25.419 |
| 0.8263888888888888 | 25.419 |
| 0.8270833333333334 | 25.419 |
| 0.8277777777777778 | 25.419 |
| 0.8284722222222222 | 25.419 |
| 0.8291666666666666 | 25.419 |
| 0.8298611111111112 | 21.024 |
| 0.8305555555555556 | 21.024 |
| 0.8312499999999999 | 21.024 |
| 0.8319444444444444 | 21.024 |
| 0.8326388888888889 | 21.024 |
| 0.8333333333333334 | 21.024 |
| 0.8340277777777777 | 21.024 |
| 0.8347222222222223 | 21.024 |
| 0.8354166666666667 | 21.024 |
| 0.8361111111111111 | 16.636 |
| 0.8368055555555555 | 16.636 |
| 0.8375 | 16.636 |
| 0.8381944444444445 | 16.636 |
| 0.8388888888888889 | 16.636 |
| 0.8395833333333332 | 12.257 |
| 0.8402777777777778 | 12.257 |
| 0.8409722222222222 | 12.257 |
| 0.8416666666666667 | 12.257 |
| 0.842361111111111 | 12.257 |
| 0.8430555555555556 | 12.257 |
| 0.84375 | 12.257 |
| 0.8444444444444444 | 7.887 |
| 0.845138888888889 | 7.887 |
| 0.8458333333333333 | 7.887 |
| 0.8465277777777778 | 7.887 |
| 0.8472222222222222 | 7.887 |
| 0.8479166666666668 | 7.887 |
| 0.8486111111111111 | 7.887 |
| 0.8493055555555555 | 7.887 |
| 0.85 | 3.525 |
| 0.8506944444444445 | 3.525 |
| 0.8513888888888889 | 3.525 |
| 0.8520833333333333 | 3.525 |
| 0.8527777777777777 | 3.525 |
| 0.8534722222222223 | 3.525 |
| 0.8541666666666666 | 3.525 |
| 0.8548611111111111 | 3.525 |
| 0.8555555555555556 | 3.525 |
| 0.8562500000000001 | 3.525 |
| 0.8569444444444444 | 3.525 |
| 0.8576388888888888 | 3.525 |
| 0.8583333333333334 | 0 |
| 0.8590277777777778 | 0 |
| 0.8597222222222222 | 0 |
| 0.8604166666666666 | 0 |
| 0.8611111111111112 | 0 |
| 0.8618055555555556 | 0 |
| 0.8624999999999999 | 0 |
| 0.8631944444444444 | 0 |
| 0.8638888888888889 | 0 |
| 0.8645833333333334 | 0 |
| 0.8652777777777777 | 0 |
| 0.8659722222222223 | 0 |
| 0.8666666666666667 | 0 |
| 0.8673611111111111 | 0 |
| 0.8680555555555555 | 0 |
| 0.86875 | 0 |
| 0.8694444444444445 | 0 |
| 0.8701388888888889 | 0 |
| 0.8708333333333332 | 0 |
| 0.8715277777777778 | 0 |
| 0.8722222222222222 | 0 |
| 0.8729166666666667 | 0 |
| 0.873611111111111 | 0 |
| 0.8743055555555556 | 0 |
| 0.875 | 0 |
| 0.8756944444444444 | 0 |
| 0.876388888888889 | 0 |
| 0.8770833333333333 | 0 |
| 0.8777777777777778 | 0 |
| 0.8784722222222222 | 0 |
| 0.8791666666666668 | 0 |
| 0.8798611111111111 | 0 |
| 0.8805555555555555 | 0 |
| 0.88125 | 0 |
| 0.8819444444444445 | 0 |
| 0.8826388888888889 | 0 |
| 0.8833333333333333 | 0 |
| 0.8840277777777777 | 0 |
| 0.8847222222222223 | 0 |
| 0.8854166666666666 | 0 |
| 0.8861111111111111 | 0 |
| 0.8868055555555556 | 0 |
| 0.8875000000000001 | 0 |
| 0.8881944444444444 | 0 |
| 0.8888888888888888 | 0 |
| 0.8895833333333334 | 0 |
| 0.8902777777777778 | 0 |
| 0.8909722222222222 | 0 |
| 0.8916666666666666 | 0 |
| 0.8923611111111112 | 0 |
| 0.8930555555555556 | 0 |
| 0.8937499999999999 | 0 |
| 0.8944444444444444 | 0 |
| 0.8951388888888889 | 0 |
| 0.8958333333333334 | 0 |
| 0.8965277777777777 | 0 |
| 0.8972222222222223 | 0 |
| 0.8979166666666667 | 0 |
| 0.8986111111111111 | 0 |
| 0.8993055555555555 | 0 |
| 0.9 | 0 |
| 0.9006944444444445 | 0 |
| 0.9013888888888889 | 0 |
| 0.9020833333333332 | 0 |
| 0.9027777777777778 | 0 |
| 0.9034722222222222 | 0 |
| 0.9041666666666667 | 0 |
| 0.904861111111111 | 0 |
| 0.9055555555555556 | 0 |
| 0.90625 | 0 |
| 0.9069444444444444 | 0 |
| 0.907638888888889 | 0 |
| 0.9083333333333333 | 0 |
| 0.9090277777777778 | 0 |
| 0.9097222222222222 | 0 |
| 0.9104166666666668 | 0 |
| 0.9111111111111111 | 0 |
| 0.9118055555555555 | 0 |
| 0.9125 | 0 |
| 0.9131944444444445 | 0 |
| 0.9138888888888889 | 0 |
| 0.9145833333333333 | 0 |
| 0.9152777777777777 | 0 |
| 0.9159722222222223 | 0 |
| 0.9166666666666666 | 0 |
| 0.9173611111111111 | 0 |
| 0.9180555555555556 | 0 |
| 0.9187500000000001 | 0 |
| 0.9194444444444444 | 0 |
| 0.9201388888888888 | 0 |
| 0.9208333333333334 | 0 |
| 0.9215277777777778 | 0 |
| 0.9222222222222222 | 0 |
| 0.9229166666666666 | 0 |
| 0.9236111111111112 | 0 |
| 0.9243055555555556 | 0 |
| 0.9249999999999999 | 0 |
| 0.9256944444444444 | 0 |
| 0.9263888888888889 | 0 |
| 0.9270833333333334 | 0 |
| 0.9277777777777777 | 0 |
| 0.9284722222222223 | 0 |
| 0.9291666666666667 | 0 |
| 0.9298611111111111 | 0 |
| 0.9305555555555555 | 0 |
| 0.93125 | 0 |
| 0.9319444444444445 | 0 |
| 0.9326388888888889 | 0 |
| 0.9333333333333332 | 0 |
| 0.9340277777777778 | 0 |
| 0.9347222222222222 | 0 |
| 0.9354166666666667 | 0 |
| 0.936111111111111 | 0 |
| 0.9368055555555556 | 0 |
| 0.9375 | 0 |
| 0.9381944444444444 | 0 |
| 0.938888888888889 | 0 |
| 0.9395833333333333 | 0 |
| 0.9402777777777778 | 0 |
| 0.9409722222222222 | 0 |
| 0.9416666666666668 | 0 |
| 0.9423611111111111 | 0 |
| 0.9430555555555555 | 0 |
| 0.94375 | 0 |
| 0.9444444444444445 | 0 |
| 0.9451388888888889 | 0 |
| 0.9458333333333333 | 0 |
| 0.9465277777777777 | 0 |
| 0.9472222222222223 | 0 |
| 0.9479166666666666 | 0 |
| 0.9486111111111111 | 0 |
| 0.9493055555555556 | 0 |
| 0.9500000000000001 | 0 |
| 0.9506944444444444 | 0 |
| 0.9513888888888888 | 0 |
| 0.9520833333333334 | 0 |
| 0.9527777777777778 | 0 |
| 0.9534722222222222 | 0 |
| 0.9541666666666666 | 0 |
| 0.9548611111111112 | 0 |
| 0.9555555555555556 | 0 |
| 0.9562499999999999 | 0 |
| 0.9569444444444444 | 0 |
| 0.9576388888888889 | 0 |
| 0.9583333333333334 | 0 |
| 0.9590277777777777 | 0 |
| 0.9597222222222223 | 0 |
| 0.9604166666666667 | 0 |
| 0.9611111111111111 | 0 |
| 0.9618055555555555 | 0 |
| 0.9625 | 0 |
| 0.9631944444444445 | 0 |
| 0.9638888888888889 | 0 |
| 0.9645833333333332 | 0 |
| 0.9652777777777778 | 0 |
| 0.9659722222222222 | 0 |
| 0.9666666666666667 | 0 |
| 0.967361111111111 | 0 |
| 0.9680555555555556 | 0 |
| 0.96875 | 0 |
| 0.9694444444444444 | 0 |
| 0.970138888888889 | 0 |
| 0.9708333333333333 | 0 |
| 0.9715277777777778 | 0 |
| 0.9722222222222222 | 0 |
| 0.9729166666666668 | 0 |
| 0.9736111111111111 | 0 |
| 0.9743055555555555 | 0 |
| 0.975 | 0 |
| 0.9756944444444445 | 0 |
| 0.9763888888888889 | 0 |
| 0.9770833333333333 | 0 |
| 0.9777777777777777 | 0 |
| 0.9784722222222223 | 0 |
| 0.9791666666666666 | 0 |
| 0.9798611111111111 | 0 |
| 0.9805555555555556 | 0 |
| 0.9812500000000001 | 0 |
| 0.9819444444444444 | 0 |
| 0.9826388888888888 | 0 |
| 0.9833333333333334 | 0 |
| 0.9840277777777778 | 0 |
| 0.9847222222222222 | 0 |
| 0.9854166666666666 | 0 |
| 0.9861111111111112 | 0 |
| 0.9868055555555556 | 0 |
| 0.9874999999999999 | 0 |
| 0.9881944444444444 | 0 |
| 0.9888888888888889 | 0 |
| 0.9895833333333334 | 0 |
| 0.9902777777777777 | 0 |
| 0.9909722222222223 | 0 |
| 0.9916666666666667 | 0 |
| 0.9923611111111111 | 0 |
| 0.9930555555555555 | 0 |
| 0.99375 | 0 |
| 0.9944444444444445 | 0 |
| 0.9951388888888889 | 0 |
| 0.9958333333333332 | 0 |
| 0.9965277777777778 | 0 |
| 0.9972222222222222 | 0 |
| 0.9979166666666667 | 0 |
| 0.998611111111111 | 0 |
| 0.9993055555555556 | 0 |